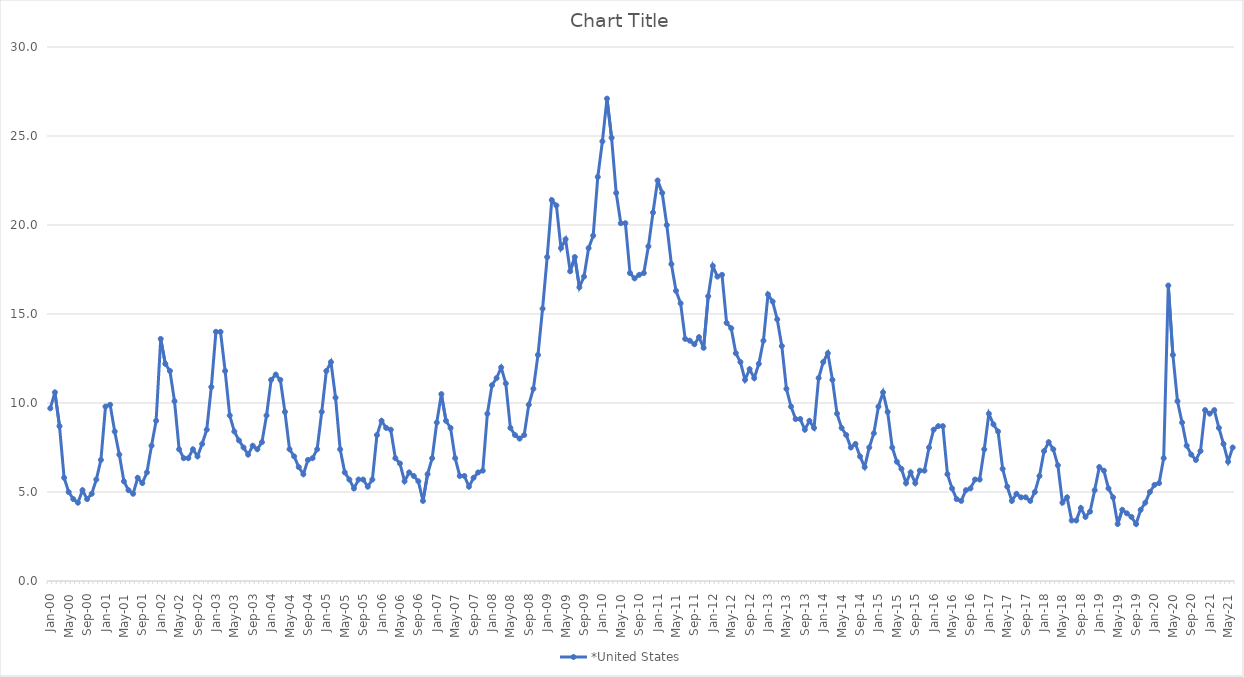
| Category | *United States | Alaska | Alabama | Arkansas | Arizona | California | Colorado | Connecticut | Delaware | Florida | Georgia | Hawaii | Iowa | Idaho | Illinois | Indiana | Kansas | Kentucky | Louisiana | Massachusetts | Maryland | Maine | Michigan | Minnesota | Missouri | Mississippi | Montana | North Carolina | North Dakota | Nebraska | New Hampshire | New Jersey | New Mexico | Nevada | New York | Ohio | Oklahoma | Oregon | Pennsylvania | Rhode Island | South Carolina | South Dakota | Tennessee | Texas | Utah | Virginia | Vermont | Washington | Wisconsin | West Virginia | Wyoming |
|---|---|---|---|---|---|---|---|---|---|---|---|---|---|---|---|---|---|---|---|---|---|---|---|---|---|---|---|---|---|---|---|---|---|---|---|---|---|---|---|---|---|---|---|---|---|---|---|---|---|---|---|
| Jan-00 | 9.7 |  |  |  |  |  |  |  |  |  |  |  |  |  |  |  |  |  |  |  |  |  |  |  |  |  |  |  |  |  |  |  |  |  |  |  |  |  |  |  |  |  |  |  |  |  |  |  |  |  |  |
| Feb-00 | 10.6 |  |  |  |  |  |  |  |  |  |  |  |  |  |  |  |  |  |  |  |  |  |  |  |  |  |  |  |  |  |  |  |  |  |  |  |  |  |  |  |  |  |  |  |  |  |  |  |  |  |  |
| Mar-00 | 8.7 |  |  |  |  |  |  |  |  |  |  |  |  |  |  |  |  |  |  |  |  |  |  |  |  |  |  |  |  |  |  |  |  |  |  |  |  |  |  |  |  |  |  |  |  |  |  |  |  |  |  |
| Apr-00 | 5.8 |  |  |  |  |  |  |  |  |  |  |  |  |  |  |  |  |  |  |  |  |  |  |  |  |  |  |  |  |  |  |  |  |  |  |  |  |  |  |  |  |  |  |  |  |  |  |  |  |  |  |
| May-00 | 5 |  |  |  |  |  |  |  |  |  |  |  |  |  |  |  |  |  |  |  |  |  |  |  |  |  |  |  |  |  |  |  |  |  |  |  |  |  |  |  |  |  |  |  |  |  |  |  |  |  |  |
| Jun-00 | 4.6 |  |  |  |  |  |  |  |  |  |  |  |  |  |  |  |  |  |  |  |  |  |  |  |  |  |  |  |  |  |  |  |  |  |  |  |  |  |  |  |  |  |  |  |  |  |  |  |  |  |  |
| Jul-00 | 4.4 |  |  |  |  |  |  |  |  |  |  |  |  |  |  |  |  |  |  |  |  |  |  |  |  |  |  |  |  |  |  |  |  |  |  |  |  |  |  |  |  |  |  |  |  |  |  |  |  |  |  |
| Aug-00 | 5.1 |  |  |  |  |  |  |  |  |  |  |  |  |  |  |  |  |  |  |  |  |  |  |  |  |  |  |  |  |  |  |  |  |  |  |  |  |  |  |  |  |  |  |  |  |  |  |  |  |  |  |
| Sep-00 | 4.6 |  |  |  |  |  |  |  |  |  |  |  |  |  |  |  |  |  |  |  |  |  |  |  |  |  |  |  |  |  |  |  |  |  |  |  |  |  |  |  |  |  |  |  |  |  |  |  |  |  |  |
| Oct-00 | 4.9 |  |  |  |  |  |  |  |  |  |  |  |  |  |  |  |  |  |  |  |  |  |  |  |  |  |  |  |  |  |  |  |  |  |  |  |  |  |  |  |  |  |  |  |  |  |  |  |  |  |  |
| Nov-00 | 5.7 |  |  |  |  |  |  |  |  |  |  |  |  |  |  |  |  |  |  |  |  |  |  |  |  |  |  |  |  |  |  |  |  |  |  |  |  |  |  |  |  |  |  |  |  |  |  |  |  |  |  |
| Dec-00 | 6.8 |  |  |  |  |  |  |  |  |  |  |  |  |  |  |  |  |  |  |  |  |  |  |  |  |  |  |  |  |  |  |  |  |  |  |  |  |  |  |  |  |  |  |  |  |  |  |  |  |  |  |
| Jan-01 | 9.8 |  |  |  |  |  |  |  |  |  |  |  |  |  |  |  |  |  |  |  |  |  |  |  |  |  |  |  |  |  |  |  |  |  |  |  |  |  |  |  |  |  |  |  |  |  |  |  |  |  |  |
| Feb-01 | 9.9 |  |  |  |  |  |  |  |  |  |  |  |  |  |  |  |  |  |  |  |  |  |  |  |  |  |  |  |  |  |  |  |  |  |  |  |  |  |  |  |  |  |  |  |  |  |  |  |  |  |  |
| Mar-01 | 8.4 |  |  |  |  |  |  |  |  |  |  |  |  |  |  |  |  |  |  |  |  |  |  |  |  |  |  |  |  |  |  |  |  |  |  |  |  |  |  |  |  |  |  |  |  |  |  |  |  |  |  |
| Apr-01 | 7.1 |  |  |  |  |  |  |  |  |  |  |  |  |  |  |  |  |  |  |  |  |  |  |  |  |  |  |  |  |  |  |  |  |  |  |  |  |  |  |  |  |  |  |  |  |  |  |  |  |  |  |
| May-01 | 5.6 |  |  |  |  |  |  |  |  |  |  |  |  |  |  |  |  |  |  |  |  |  |  |  |  |  |  |  |  |  |  |  |  |  |  |  |  |  |  |  |  |  |  |  |  |  |  |  |  |  |  |
| Jun-01 | 5.1 |  |  |  |  |  |  |  |  |  |  |  |  |  |  |  |  |  |  |  |  |  |  |  |  |  |  |  |  |  |  |  |  |  |  |  |  |  |  |  |  |  |  |  |  |  |  |  |  |  |  |
| Jul-01 | 4.9 |  |  |  |  |  |  |  |  |  |  |  |  |  |  |  |  |  |  |  |  |  |  |  |  |  |  |  |  |  |  |  |  |  |  |  |  |  |  |  |  |  |  |  |  |  |  |  |  |  |  |
| Aug-01 | 5.8 |  |  |  |  |  |  |  |  |  |  |  |  |  |  |  |  |  |  |  |  |  |  |  |  |  |  |  |  |  |  |  |  |  |  |  |  |  |  |  |  |  |  |  |  |  |  |  |  |  |  |
| Sep-01 | 5.5 |  |  |  |  |  |  |  |  |  |  |  |  |  |  |  |  |  |  |  |  |  |  |  |  |  |  |  |  |  |  |  |  |  |  |  |  |  |  |  |  |  |  |  |  |  |  |  |  |  |  |
| Oct-01 | 6.1 |  |  |  |  |  |  |  |  |  |  |  |  |  |  |  |  |  |  |  |  |  |  |  |  |  |  |  |  |  |  |  |  |  |  |  |  |  |  |  |  |  |  |  |  |  |  |  |  |  |  |
| Nov-01 | 7.6 |  |  |  |  |  |  |  |  |  |  |  |  |  |  |  |  |  |  |  |  |  |  |  |  |  |  |  |  |  |  |  |  |  |  |  |  |  |  |  |  |  |  |  |  |  |  |  |  |  |  |
| Dec-01 | 9 |  |  |  |  |  |  |  |  |  |  |  |  |  |  |  |  |  |  |  |  |  |  |  |  |  |  |  |  |  |  |  |  |  |  |  |  |  |  |  |  |  |  |  |  |  |  |  |  |  |  |
| Jan-02 | 13.6 |  |  |  |  |  |  |  |  |  |  |  |  |  |  |  |  |  |  |  |  |  |  |  |  |  |  |  |  |  |  |  |  |  |  |  |  |  |  |  |  |  |  |  |  |  |  |  |  |  |  |
| Feb-02 | 12.2 |  |  |  |  |  |  |  |  |  |  |  |  |  |  |  |  |  |  |  |  |  |  |  |  |  |  |  |  |  |  |  |  |  |  |  |  |  |  |  |  |  |  |  |  |  |  |  |  |  |  |
| Mar-02 | 11.8 |  |  |  |  |  |  |  |  |  |  |  |  |  |  |  |  |  |  |  |  |  |  |  |  |  |  |  |  |  |  |  |  |  |  |  |  |  |  |  |  |  |  |  |  |  |  |  |  |  |  |
| Apr-02 | 10.1 |  |  |  |  |  |  |  |  |  |  |  |  |  |  |  |  |  |  |  |  |  |  |  |  |  |  |  |  |  |  |  |  |  |  |  |  |  |  |  |  |  |  |  |  |  |  |  |  |  |  |
| May-02 | 7.4 |  |  |  |  |  |  |  |  |  |  |  |  |  |  |  |  |  |  |  |  |  |  |  |  |  |  |  |  |  |  |  |  |  |  |  |  |  |  |  |  |  |  |  |  |  |  |  |  |  |  |
| Jun-02 | 6.9 |  |  |  |  |  |  |  |  |  |  |  |  |  |  |  |  |  |  |  |  |  |  |  |  |  |  |  |  |  |  |  |  |  |  |  |  |  |  |  |  |  |  |  |  |  |  |  |  |  |  |
| Jul-02 | 6.9 |  |  |  |  |  |  |  |  |  |  |  |  |  |  |  |  |  |  |  |  |  |  |  |  |  |  |  |  |  |  |  |  |  |  |  |  |  |  |  |  |  |  |  |  |  |  |  |  |  |  |
| Aug-02 | 7.4 |  |  |  |  |  |  |  |  |  |  |  |  |  |  |  |  |  |  |  |  |  |  |  |  |  |  |  |  |  |  |  |  |  |  |  |  |  |  |  |  |  |  |  |  |  |  |  |  |  |  |
| Sep-02 | 7 |  |  |  |  |  |  |  |  |  |  |  |  |  |  |  |  |  |  |  |  |  |  |  |  |  |  |  |  |  |  |  |  |  |  |  |  |  |  |  |  |  |  |  |  |  |  |  |  |  |  |
| Oct-02 | 7.7 |  |  |  |  |  |  |  |  |  |  |  |  |  |  |  |  |  |  |  |  |  |  |  |  |  |  |  |  |  |  |  |  |  |  |  |  |  |  |  |  |  |  |  |  |  |  |  |  |  |  |
| Nov-02 | 8.5 |  |  |  |  |  |  |  |  |  |  |  |  |  |  |  |  |  |  |  |  |  |  |  |  |  |  |  |  |  |  |  |  |  |  |  |  |  |  |  |  |  |  |  |  |  |  |  |  |  |  |
| Dec-02 | 10.9 |  |  |  |  |  |  |  |  |  |  |  |  |  |  |  |  |  |  |  |  |  |  |  |  |  |  |  |  |  |  |  |  |  |  |  |  |  |  |  |  |  |  |  |  |  |  |  |  |  |  |
| Jan-03 | 14 |  |  |  |  |  |  |  |  |  |  |  |  |  |  |  |  |  |  |  |  |  |  |  |  |  |  |  |  |  |  |  |  |  |  |  |  |  |  |  |  |  |  |  |  |  |  |  |  |  |  |
| Feb-03 | 14 |  |  |  |  |  |  |  |  |  |  |  |  |  |  |  |  |  |  |  |  |  |  |  |  |  |  |  |  |  |  |  |  |  |  |  |  |  |  |  |  |  |  |  |  |  |  |  |  |  |  |
| Mar-03 | 11.8 |  |  |  |  |  |  |  |  |  |  |  |  |  |  |  |  |  |  |  |  |  |  |  |  |  |  |  |  |  |  |  |  |  |  |  |  |  |  |  |  |  |  |  |  |  |  |  |  |  |  |
| Apr-03 | 9.3 |  |  |  |  |  |  |  |  |  |  |  |  |  |  |  |  |  |  |  |  |  |  |  |  |  |  |  |  |  |  |  |  |  |  |  |  |  |  |  |  |  |  |  |  |  |  |  |  |  |  |
| May-03 | 8.4 |  |  |  |  |  |  |  |  |  |  |  |  |  |  |  |  |  |  |  |  |  |  |  |  |  |  |  |  |  |  |  |  |  |  |  |  |  |  |  |  |  |  |  |  |  |  |  |  |  |  |
| Jun-03 | 7.9 |  |  |  |  |  |  |  |  |  |  |  |  |  |  |  |  |  |  |  |  |  |  |  |  |  |  |  |  |  |  |  |  |  |  |  |  |  |  |  |  |  |  |  |  |  |  |  |  |  |  |
| Jul-03 | 7.5 |  |  |  |  |  |  |  |  |  |  |  |  |  |  |  |  |  |  |  |  |  |  |  |  |  |  |  |  |  |  |  |  |  |  |  |  |  |  |  |  |  |  |  |  |  |  |  |  |  |  |
| Aug-03 | 7.1 |  |  |  |  |  |  |  |  |  |  |  |  |  |  |  |  |  |  |  |  |  |  |  |  |  |  |  |  |  |  |  |  |  |  |  |  |  |  |  |  |  |  |  |  |  |  |  |  |  |  |
| Sep-03 | 7.6 |  |  |  |  |  |  |  |  |  |  |  |  |  |  |  |  |  |  |  |  |  |  |  |  |  |  |  |  |  |  |  |  |  |  |  |  |  |  |  |  |  |  |  |  |  |  |  |  |  |  |
| Oct-03 | 7.4 |  |  |  |  |  |  |  |  |  |  |  |  |  |  |  |  |  |  |  |  |  |  |  |  |  |  |  |  |  |  |  |  |  |  |  |  |  |  |  |  |  |  |  |  |  |  |  |  |  |  |
| Nov-03 | 7.8 |  |  |  |  |  |  |  |  |  |  |  |  |  |  |  |  |  |  |  |  |  |  |  |  |  |  |  |  |  |  |  |  |  |  |  |  |  |  |  |  |  |  |  |  |  |  |  |  |  |  |
| Dec-03 | 9.3 |  |  |  |  |  |  |  |  |  |  |  |  |  |  |  |  |  |  |  |  |  |  |  |  |  |  |  |  |  |  |  |  |  |  |  |  |  |  |  |  |  |  |  |  |  |  |  |  |  |  |
| Jan-04 | 11.3 |  |  |  |  |  |  |  |  |  |  |  |  |  |  |  |  |  |  |  |  |  |  |  |  |  |  |  |  |  |  |  |  |  |  |  |  |  |  |  |  |  |  |  |  |  |  |  |  |  |  |
| Feb-04 | 11.6 |  |  |  |  |  |  |  |  |  |  |  |  |  |  |  |  |  |  |  |  |  |  |  |  |  |  |  |  |  |  |  |  |  |  |  |  |  |  |  |  |  |  |  |  |  |  |  |  |  |  |
| Mar-04 | 11.3 |  |  |  |  |  |  |  |  |  |  |  |  |  |  |  |  |  |  |  |  |  |  |  |  |  |  |  |  |  |  |  |  |  |  |  |  |  |  |  |  |  |  |  |  |  |  |  |  |  |  |
| Apr-04 | 9.5 |  |  |  |  |  |  |  |  |  |  |  |  |  |  |  |  |  |  |  |  |  |  |  |  |  |  |  |  |  |  |  |  |  |  |  |  |  |  |  |  |  |  |  |  |  |  |  |  |  |  |
| May-04 | 7.4 |  |  |  |  |  |  |  |  |  |  |  |  |  |  |  |  |  |  |  |  |  |  |  |  |  |  |  |  |  |  |  |  |  |  |  |  |  |  |  |  |  |  |  |  |  |  |  |  |  |  |
| Jun-04 | 7 |  |  |  |  |  |  |  |  |  |  |  |  |  |  |  |  |  |  |  |  |  |  |  |  |  |  |  |  |  |  |  |  |  |  |  |  |  |  |  |  |  |  |  |  |  |  |  |  |  |  |
| Jul-04 | 6.4 |  |  |  |  |  |  |  |  |  |  |  |  |  |  |  |  |  |  |  |  |  |  |  |  |  |  |  |  |  |  |  |  |  |  |  |  |  |  |  |  |  |  |  |  |  |  |  |  |  |  |
| Aug-04 | 6 |  |  |  |  |  |  |  |  |  |  |  |  |  |  |  |  |  |  |  |  |  |  |  |  |  |  |  |  |  |  |  |  |  |  |  |  |  |  |  |  |  |  |  |  |  |  |  |  |  |  |
| Sep-04 | 6.8 |  |  |  |  |  |  |  |  |  |  |  |  |  |  |  |  |  |  |  |  |  |  |  |  |  |  |  |  |  |  |  |  |  |  |  |  |  |  |  |  |  |  |  |  |  |  |  |  |  |  |
| Oct-04 | 6.9 |  |  |  |  |  |  |  |  |  |  |  |  |  |  |  |  |  |  |  |  |  |  |  |  |  |  |  |  |  |  |  |  |  |  |  |  |  |  |  |  |  |  |  |  |  |  |  |  |  |  |
| Nov-04 | 7.4 |  |  |  |  |  |  |  |  |  |  |  |  |  |  |  |  |  |  |  |  |  |  |  |  |  |  |  |  |  |  |  |  |  |  |  |  |  |  |  |  |  |  |  |  |  |  |  |  |  |  |
| Dec-04 | 9.5 |  |  |  |  |  |  |  |  |  |  |  |  |  |  |  |  |  |  |  |  |  |  |  |  |  |  |  |  |  |  |  |  |  |  |  |  |  |  |  |  |  |  |  |  |  |  |  |  |  |  |
| Jan-05 | 11.8 |  |  |  |  |  |  |  |  |  |  |  |  |  |  |  |  |  |  |  |  |  |  |  |  |  |  |  |  |  |  |  |  |  |  |  |  |  |  |  |  |  |  |  |  |  |  |  |  |  |  |
| Feb-05 | 12.3 |  |  |  |  |  |  |  |  |  |  |  |  |  |  |  |  |  |  |  |  |  |  |  |  |  |  |  |  |  |  |  |  |  |  |  |  |  |  |  |  |  |  |  |  |  |  |  |  |  |  |
| Mar-05 | 10.3 |  |  |  |  |  |  |  |  |  |  |  |  |  |  |  |  |  |  |  |  |  |  |  |  |  |  |  |  |  |  |  |  |  |  |  |  |  |  |  |  |  |  |  |  |  |  |  |  |  |  |
| Apr-05 | 7.4 |  |  |  |  |  |  |  |  |  |  |  |  |  |  |  |  |  |  |  |  |  |  |  |  |  |  |  |  |  |  |  |  |  |  |  |  |  |  |  |  |  |  |  |  |  |  |  |  |  |  |
| May-05 | 6.1 |  |  |  |  |  |  |  |  |  |  |  |  |  |  |  |  |  |  |  |  |  |  |  |  |  |  |  |  |  |  |  |  |  |  |  |  |  |  |  |  |  |  |  |  |  |  |  |  |  |  |
| Jun-05 | 5.7 |  |  |  |  |  |  |  |  |  |  |  |  |  |  |  |  |  |  |  |  |  |  |  |  |  |  |  |  |  |  |  |  |  |  |  |  |  |  |  |  |  |  |  |  |  |  |  |  |  |  |
| Jul-05 | 5.2 |  |  |  |  |  |  |  |  |  |  |  |  |  |  |  |  |  |  |  |  |  |  |  |  |  |  |  |  |  |  |  |  |  |  |  |  |  |  |  |  |  |  |  |  |  |  |  |  |  |  |
| Aug-05 | 5.7 |  |  |  |  |  |  |  |  |  |  |  |  |  |  |  |  |  |  |  |  |  |  |  |  |  |  |  |  |  |  |  |  |  |  |  |  |  |  |  |  |  |  |  |  |  |  |  |  |  |  |
| Sep-05 | 5.7 |  |  |  |  |  |  |  |  |  |  |  |  |  |  |  |  |  |  |  |  |  |  |  |  |  |  |  |  |  |  |  |  |  |  |  |  |  |  |  |  |  |  |  |  |  |  |  |  |  |  |
| Oct-05 | 5.3 |  |  |  |  |  |  |  |  |  |  |  |  |  |  |  |  |  |  |  |  |  |  |  |  |  |  |  |  |  |  |  |  |  |  |  |  |  |  |  |  |  |  |  |  |  |  |  |  |  |  |
| Nov-05 | 5.7 |  |  |  |  |  |  |  |  |  |  |  |  |  |  |  |  |  |  |  |  |  |  |  |  |  |  |  |  |  |  |  |  |  |  |  |  |  |  |  |  |  |  |  |  |  |  |  |  |  |  |
| Dec-05 | 8.2 |  |  |  |  |  |  |  |  |  |  |  |  |  |  |  |  |  |  |  |  |  |  |  |  |  |  |  |  |  |  |  |  |  |  |  |  |  |  |  |  |  |  |  |  |  |  |  |  |  |  |
| Jan-06 | 9 |  |  |  |  |  |  |  |  |  |  |  |  |  |  |  |  |  |  |  |  |  |  |  |  |  |  |  |  |  |  |  |  |  |  |  |  |  |  |  |  |  |  |  |  |  |  |  |  |  |  |
| Feb-06 | 8.6 |  |  |  |  |  |  |  |  |  |  |  |  |  |  |  |  |  |  |  |  |  |  |  |  |  |  |  |  |  |  |  |  |  |  |  |  |  |  |  |  |  |  |  |  |  |  |  |  |  |  |
| Mar-06 | 8.5 |  |  |  |  |  |  |  |  |  |  |  |  |  |  |  |  |  |  |  |  |  |  |  |  |  |  |  |  |  |  |  |  |  |  |  |  |  |  |  |  |  |  |  |  |  |  |  |  |  |  |
| Apr-06 | 6.9 |  |  |  |  |  |  |  |  |  |  |  |  |  |  |  |  |  |  |  |  |  |  |  |  |  |  |  |  |  |  |  |  |  |  |  |  |  |  |  |  |  |  |  |  |  |  |  |  |  |  |
| May-06 | 6.6 |  |  |  |  |  |  |  |  |  |  |  |  |  |  |  |  |  |  |  |  |  |  |  |  |  |  |  |  |  |  |  |  |  |  |  |  |  |  |  |  |  |  |  |  |  |  |  |  |  |  |
| Jun-06 | 5.6 |  |  |  |  |  |  |  |  |  |  |  |  |  |  |  |  |  |  |  |  |  |  |  |  |  |  |  |  |  |  |  |  |  |  |  |  |  |  |  |  |  |  |  |  |  |  |  |  |  |  |
| Jul-06 | 6.1 |  |  |  |  |  |  |  |  |  |  |  |  |  |  |  |  |  |  |  |  |  |  |  |  |  |  |  |  |  |  |  |  |  |  |  |  |  |  |  |  |  |  |  |  |  |  |  |  |  |  |
| Aug-06 | 5.9 |  |  |  |  |  |  |  |  |  |  |  |  |  |  |  |  |  |  |  |  |  |  |  |  |  |  |  |  |  |  |  |  |  |  |  |  |  |  |  |  |  |  |  |  |  |  |  |  |  |  |
| Sep-06 | 5.6 |  |  |  |  |  |  |  |  |  |  |  |  |  |  |  |  |  |  |  |  |  |  |  |  |  |  |  |  |  |  |  |  |  |  |  |  |  |  |  |  |  |  |  |  |  |  |  |  |  |  |
| Oct-06 | 4.5 |  |  |  |  |  |  |  |  |  |  |  |  |  |  |  |  |  |  |  |  |  |  |  |  |  |  |  |  |  |  |  |  |  |  |  |  |  |  |  |  |  |  |  |  |  |  |  |  |  |  |
| Nov-06 | 6 |  |  |  |  |  |  |  |  |  |  |  |  |  |  |  |  |  |  |  |  |  |  |  |  |  |  |  |  |  |  |  |  |  |  |  |  |  |  |  |  |  |  |  |  |  |  |  |  |  |  |
| Dec-06 | 6.9 |  |  |  |  |  |  |  |  |  |  |  |  |  |  |  |  |  |  |  |  |  |  |  |  |  |  |  |  |  |  |  |  |  |  |  |  |  |  |  |  |  |  |  |  |  |  |  |  |  |  |
| Jan-07 | 8.9 |  |  |  |  |  |  |  |  |  |  |  |  |  |  |  |  |  |  |  |  |  |  |  |  |  |  |  |  |  |  |  |  |  |  |  |  |  |  |  |  |  |  |  |  |  |  |  |  |  |  |
| Feb-07 | 10.5 |  |  |  |  |  |  |  |  |  |  |  |  |  |  |  |  |  |  |  |  |  |  |  |  |  |  |  |  |  |  |  |  |  |  |  |  |  |  |  |  |  |  |  |  |  |  |  |  |  |  |
| Mar-07 | 9 |  |  |  |  |  |  |  |  |  |  |  |  |  |  |  |  |  |  |  |  |  |  |  |  |  |  |  |  |  |  |  |  |  |  |  |  |  |  |  |  |  |  |  |  |  |  |  |  |  |  |
| Apr-07 | 8.6 |  |  |  |  |  |  |  |  |  |  |  |  |  |  |  |  |  |  |  |  |  |  |  |  |  |  |  |  |  |  |  |  |  |  |  |  |  |  |  |  |  |  |  |  |  |  |  |  |  |  |
| May-07 | 6.9 |  |  |  |  |  |  |  |  |  |  |  |  |  |  |  |  |  |  |  |  |  |  |  |  |  |  |  |  |  |  |  |  |  |  |  |  |  |  |  |  |  |  |  |  |  |  |  |  |  |  |
| Jun-07 | 5.9 |  |  |  |  |  |  |  |  |  |  |  |  |  |  |  |  |  |  |  |  |  |  |  |  |  |  |  |  |  |  |  |  |  |  |  |  |  |  |  |  |  |  |  |  |  |  |  |  |  |  |
| Jul-07 | 5.9 |  |  |  |  |  |  |  |  |  |  |  |  |  |  |  |  |  |  |  |  |  |  |  |  |  |  |  |  |  |  |  |  |  |  |  |  |  |  |  |  |  |  |  |  |  |  |  |  |  |  |
| Aug-07 | 5.3 |  |  |  |  |  |  |  |  |  |  |  |  |  |  |  |  |  |  |  |  |  |  |  |  |  |  |  |  |  |  |  |  |  |  |  |  |  |  |  |  |  |  |  |  |  |  |  |  |  |  |
| Sep-07 | 5.8 |  |  |  |  |  |  |  |  |  |  |  |  |  |  |  |  |  |  |  |  |  |  |  |  |  |  |  |  |  |  |  |  |  |  |  |  |  |  |  |  |  |  |  |  |  |  |  |  |  |  |
| Oct-07 | 6.1 |  |  |  |  |  |  |  |  |  |  |  |  |  |  |  |  |  |  |  |  |  |  |  |  |  |  |  |  |  |  |  |  |  |  |  |  |  |  |  |  |  |  |  |  |  |  |  |  |  |  |
| Nov-07 | 6.2 |  |  |  |  |  |  |  |  |  |  |  |  |  |  |  |  |  |  |  |  |  |  |  |  |  |  |  |  |  |  |  |  |  |  |  |  |  |  |  |  |  |  |  |  |  |  |  |  |  |  |
| Dec-07 | 9.4 |  |  |  |  |  |  |  |  |  |  |  |  |  |  |  |  |  |  |  |  |  |  |  |  |  |  |  |  |  |  |  |  |  |  |  |  |  |  |  |  |  |  |  |  |  |  |  |  |  |  |
| Jan-08 | 11 |  |  |  |  |  |  |  |  |  |  |  |  |  |  |  |  |  |  |  |  |  |  |  |  |  |  |  |  |  |  |  |  |  |  |  |  |  |  |  |  |  |  |  |  |  |  |  |  |  |  |
| Feb-08 | 11.4 |  |  |  |  |  |  |  |  |  |  |  |  |  |  |  |  |  |  |  |  |  |  |  |  |  |  |  |  |  |  |  |  |  |  |  |  |  |  |  |  |  |  |  |  |  |  |  |  |  |  |
| Mar-08 | 12 |  |  |  |  |  |  |  |  |  |  |  |  |  |  |  |  |  |  |  |  |  |  |  |  |  |  |  |  |  |  |  |  |  |  |  |  |  |  |  |  |  |  |  |  |  |  |  |  |  |  |
| Apr-08 | 11.1 |  |  |  |  |  |  |  |  |  |  |  |  |  |  |  |  |  |  |  |  |  |  |  |  |  |  |  |  |  |  |  |  |  |  |  |  |  |  |  |  |  |  |  |  |  |  |  |  |  |  |
| May-08 | 8.6 |  |  |  |  |  |  |  |  |  |  |  |  |  |  |  |  |  |  |  |  |  |  |  |  |  |  |  |  |  |  |  |  |  |  |  |  |  |  |  |  |  |  |  |  |  |  |  |  |  |  |
| Jun-08 | 8.2 |  |  |  |  |  |  |  |  |  |  |  |  |  |  |  |  |  |  |  |  |  |  |  |  |  |  |  |  |  |  |  |  |  |  |  |  |  |  |  |  |  |  |  |  |  |  |  |  |  |  |
| Jul-08 | 8 |  |  |  |  |  |  |  |  |  |  |  |  |  |  |  |  |  |  |  |  |  |  |  |  |  |  |  |  |  |  |  |  |  |  |  |  |  |  |  |  |  |  |  |  |  |  |  |  |  |  |
| Aug-08 | 8.2 |  |  |  |  |  |  |  |  |  |  |  |  |  |  |  |  |  |  |  |  |  |  |  |  |  |  |  |  |  |  |  |  |  |  |  |  |  |  |  |  |  |  |  |  |  |  |  |  |  |  |
| Sep-08 | 9.9 |  |  |  |  |  |  |  |  |  |  |  |  |  |  |  |  |  |  |  |  |  |  |  |  |  |  |  |  |  |  |  |  |  |  |  |  |  |  |  |  |  |  |  |  |  |  |  |  |  |  |
| Oct-08 | 10.8 |  |  |  |  |  |  |  |  |  |  |  |  |  |  |  |  |  |  |  |  |  |  |  |  |  |  |  |  |  |  |  |  |  |  |  |  |  |  |  |  |  |  |  |  |  |  |  |  |  |  |
| Nov-08 | 12.7 |  |  |  |  |  |  |  |  |  |  |  |  |  |  |  |  |  |  |  |  |  |  |  |  |  |  |  |  |  |  |  |  |  |  |  |  |  |  |  |  |  |  |  |  |  |  |  |  |  |  |
| Dec-08 | 15.3 |  |  |  |  |  |  |  |  |  |  |  |  |  |  |  |  |  |  |  |  |  |  |  |  |  |  |  |  |  |  |  |  |  |  |  |  |  |  |  |  |  |  |  |  |  |  |  |  |  |  |
| Jan-09 | 18.2 |  |  |  |  |  |  |  |  |  |  |  |  |  |  |  |  |  |  |  |  |  |  |  |  |  |  |  |  |  |  |  |  |  |  |  |  |  |  |  |  |  |  |  |  |  |  |  |  |  |  |
| Feb-09 | 21.4 |  |  |  |  |  |  |  |  |  |  |  |  |  |  |  |  |  |  |  |  |  |  |  |  |  |  |  |  |  |  |  |  |  |  |  |  |  |  |  |  |  |  |  |  |  |  |  |  |  |  |
| Mar-09 | 21.1 |  |  |  |  |  |  |  |  |  |  |  |  |  |  |  |  |  |  |  |  |  |  |  |  |  |  |  |  |  |  |  |  |  |  |  |  |  |  |  |  |  |  |  |  |  |  |  |  |  |  |
| Apr-09 | 18.7 |  |  |  |  |  |  |  |  |  |  |  |  |  |  |  |  |  |  |  |  |  |  |  |  |  |  |  |  |  |  |  |  |  |  |  |  |  |  |  |  |  |  |  |  |  |  |  |  |  |  |
| May-09 | 19.2 |  |  |  |  |  |  |  |  |  |  |  |  |  |  |  |  |  |  |  |  |  |  |  |  |  |  |  |  |  |  |  |  |  |  |  |  |  |  |  |  |  |  |  |  |  |  |  |  |  |  |
| Jun-09 | 17.4 |  |  |  |  |  |  |  |  |  |  |  |  |  |  |  |  |  |  |  |  |  |  |  |  |  |  |  |  |  |  |  |  |  |  |  |  |  |  |  |  |  |  |  |  |  |  |  |  |  |  |
| Jul-09 | 18.2 |  |  |  |  |  |  |  |  |  |  |  |  |  |  |  |  |  |  |  |  |  |  |  |  |  |  |  |  |  |  |  |  |  |  |  |  |  |  |  |  |  |  |  |  |  |  |  |  |  |  |
| Aug-09 | 16.5 |  |  |  |  |  |  |  |  |  |  |  |  |  |  |  |  |  |  |  |  |  |  |  |  |  |  |  |  |  |  |  |  |  |  |  |  |  |  |  |  |  |  |  |  |  |  |  |  |  |  |
| Sep-09 | 17.1 |  |  |  |  |  |  |  |  |  |  |  |  |  |  |  |  |  |  |  |  |  |  |  |  |  |  |  |  |  |  |  |  |  |  |  |  |  |  |  |  |  |  |  |  |  |  |  |  |  |  |
| Oct-09 | 18.7 |  |  |  |  |  |  |  |  |  |  |  |  |  |  |  |  |  |  |  |  |  |  |  |  |  |  |  |  |  |  |  |  |  |  |  |  |  |  |  |  |  |  |  |  |  |  |  |  |  |  |
| Nov-09 | 19.4 |  |  |  |  |  |  |  |  |  |  |  |  |  |  |  |  |  |  |  |  |  |  |  |  |  |  |  |  |  |  |  |  |  |  |  |  |  |  |  |  |  |  |  |  |  |  |  |  |  |  |
| Dec-09 | 22.7 |  |  |  |  |  |  |  |  |  |  |  |  |  |  |  |  |  |  |  |  |  |  |  |  |  |  |  |  |  |  |  |  |  |  |  |  |  |  |  |  |  |  |  |  |  |  |  |  |  |  |
| Jan-10 | 24.7 |  |  |  |  |  |  |  |  |  |  |  |  |  |  |  |  |  |  |  |  |  |  |  |  |  |  |  |  |  |  |  |  |  |  |  |  |  |  |  |  |  |  |  |  |  |  |  |  |  |  |
| Feb-10 | 27.1 |  |  |  |  |  |  |  |  |  |  |  |  |  |  |  |  |  |  |  |  |  |  |  |  |  |  |  |  |  |  |  |  |  |  |  |  |  |  |  |  |  |  |  |  |  |  |  |  |  |  |
| Mar-10 | 24.9 |  |  |  |  |  |  |  |  |  |  |  |  |  |  |  |  |  |  |  |  |  |  |  |  |  |  |  |  |  |  |  |  |  |  |  |  |  |  |  |  |  |  |  |  |  |  |  |  |  |  |
| Apr-10 | 21.8 |  |  |  |  |  |  |  |  |  |  |  |  |  |  |  |  |  |  |  |  |  |  |  |  |  |  |  |  |  |  |  |  |  |  |  |  |  |  |  |  |  |  |  |  |  |  |  |  |  |  |
| May-10 | 20.1 |  |  |  |  |  |  |  |  |  |  |  |  |  |  |  |  |  |  |  |  |  |  |  |  |  |  |  |  |  |  |  |  |  |  |  |  |  |  |  |  |  |  |  |  |  |  |  |  |  |  |
| Jun-10 | 20.1 |  |  |  |  |  |  |  |  |  |  |  |  |  |  |  |  |  |  |  |  |  |  |  |  |  |  |  |  |  |  |  |  |  |  |  |  |  |  |  |  |  |  |  |  |  |  |  |  |  |  |
| Jul-10 | 17.3 |  |  |  |  |  |  |  |  |  |  |  |  |  |  |  |  |  |  |  |  |  |  |  |  |  |  |  |  |  |  |  |  |  |  |  |  |  |  |  |  |  |  |  |  |  |  |  |  |  |  |
| Aug-10 | 17 |  |  |  |  |  |  |  |  |  |  |  |  |  |  |  |  |  |  |  |  |  |  |  |  |  |  |  |  |  |  |  |  |  |  |  |  |  |  |  |  |  |  |  |  |  |  |  |  |  |  |
| Sep-10 | 17.2 |  |  |  |  |  |  |  |  |  |  |  |  |  |  |  |  |  |  |  |  |  |  |  |  |  |  |  |  |  |  |  |  |  |  |  |  |  |  |  |  |  |  |  |  |  |  |  |  |  |  |
| Oct-10 | 17.3 |  |  |  |  |  |  |  |  |  |  |  |  |  |  |  |  |  |  |  |  |  |  |  |  |  |  |  |  |  |  |  |  |  |  |  |  |  |  |  |  |  |  |  |  |  |  |  |  |  |  |
| Nov-10 | 18.8 |  |  |  |  |  |  |  |  |  |  |  |  |  |  |  |  |  |  |  |  |  |  |  |  |  |  |  |  |  |  |  |  |  |  |  |  |  |  |  |  |  |  |  |  |  |  |  |  |  |  |
| Dec-10 | 20.7 |  |  |  |  |  |  |  |  |  |  |  |  |  |  |  |  |  |  |  |  |  |  |  |  |  |  |  |  |  |  |  |  |  |  |  |  |  |  |  |  |  |  |  |  |  |  |  |  |  |  |
| Jan-11 | 22.5 |  |  |  |  |  |  |  |  |  |  |  |  |  |  |  |  |  |  |  |  |  |  |  |  |  |  |  |  |  |  |  |  |  |  |  |  |  |  |  |  |  |  |  |  |  |  |  |  |  |  |
| Feb-11 | 21.8 |  |  |  |  |  |  |  |  |  |  |  |  |  |  |  |  |  |  |  |  |  |  |  |  |  |  |  |  |  |  |  |  |  |  |  |  |  |  |  |  |  |  |  |  |  |  |  |  |  |  |
| Mar-11 | 20 |  |  |  |  |  |  |  |  |  |  |  |  |  |  |  |  |  |  |  |  |  |  |  |  |  |  |  |  |  |  |  |  |  |  |  |  |  |  |  |  |  |  |  |  |  |  |  |  |  |  |
| Apr-11 | 17.8 |  |  |  |  |  |  |  |  |  |  |  |  |  |  |  |  |  |  |  |  |  |  |  |  |  |  |  |  |  |  |  |  |  |  |  |  |  |  |  |  |  |  |  |  |  |  |  |  |  |  |
| May-11 | 16.3 |  |  |  |  |  |  |  |  |  |  |  |  |  |  |  |  |  |  |  |  |  |  |  |  |  |  |  |  |  |  |  |  |  |  |  |  |  |  |  |  |  |  |  |  |  |  |  |  |  |  |
| Jun-11 | 15.6 |  |  |  |  |  |  |  |  |  |  |  |  |  |  |  |  |  |  |  |  |  |  |  |  |  |  |  |  |  |  |  |  |  |  |  |  |  |  |  |  |  |  |  |  |  |  |  |  |  |  |
| Jul-11 | 13.6 |  |  |  |  |  |  |  |  |  |  |  |  |  |  |  |  |  |  |  |  |  |  |  |  |  |  |  |  |  |  |  |  |  |  |  |  |  |  |  |  |  |  |  |  |  |  |  |  |  |  |
| Aug-11 | 13.5 |  |  |  |  |  |  |  |  |  |  |  |  |  |  |  |  |  |  |  |  |  |  |  |  |  |  |  |  |  |  |  |  |  |  |  |  |  |  |  |  |  |  |  |  |  |  |  |  |  |  |
| Sep-11 | 13.3 |  |  |  |  |  |  |  |  |  |  |  |  |  |  |  |  |  |  |  |  |  |  |  |  |  |  |  |  |  |  |  |  |  |  |  |  |  |  |  |  |  |  |  |  |  |  |  |  |  |  |
| Oct-11 | 13.7 |  |  |  |  |  |  |  |  |  |  |  |  |  |  |  |  |  |  |  |  |  |  |  |  |  |  |  |  |  |  |  |  |  |  |  |  |  |  |  |  |  |  |  |  |  |  |  |  |  |  |
| Nov-11 | 13.1 |  |  |  |  |  |  |  |  |  |  |  |  |  |  |  |  |  |  |  |  |  |  |  |  |  |  |  |  |  |  |  |  |  |  |  |  |  |  |  |  |  |  |  |  |  |  |  |  |  |  |
| Dec-11 | 16 |  |  |  |  |  |  |  |  |  |  |  |  |  |  |  |  |  |  |  |  |  |  |  |  |  |  |  |  |  |  |  |  |  |  |  |  |  |  |  |  |  |  |  |  |  |  |  |  |  |  |
| Jan-12 | 17.7 |  |  |  |  |  |  |  |  |  |  |  |  |  |  |  |  |  |  |  |  |  |  |  |  |  |  |  |  |  |  |  |  |  |  |  |  |  |  |  |  |  |  |  |  |  |  |  |  |  |  |
| Feb-12 | 17.1 |  |  |  |  |  |  |  |  |  |  |  |  |  |  |  |  |  |  |  |  |  |  |  |  |  |  |  |  |  |  |  |  |  |  |  |  |  |  |  |  |  |  |  |  |  |  |  |  |  |  |
| Mar-12 | 17.2 |  |  |  |  |  |  |  |  |  |  |  |  |  |  |  |  |  |  |  |  |  |  |  |  |  |  |  |  |  |  |  |  |  |  |  |  |  |  |  |  |  |  |  |  |  |  |  |  |  |  |
| Apr-12 | 14.5 |  |  |  |  |  |  |  |  |  |  |  |  |  |  |  |  |  |  |  |  |  |  |  |  |  |  |  |  |  |  |  |  |  |  |  |  |  |  |  |  |  |  |  |  |  |  |  |  |  |  |
| May-12 | 14.2 |  |  |  |  |  |  |  |  |  |  |  |  |  |  |  |  |  |  |  |  |  |  |  |  |  |  |  |  |  |  |  |  |  |  |  |  |  |  |  |  |  |  |  |  |  |  |  |  |  |  |
| Jun-12 | 12.8 |  |  |  |  |  |  |  |  |  |  |  |  |  |  |  |  |  |  |  |  |  |  |  |  |  |  |  |  |  |  |  |  |  |  |  |  |  |  |  |  |  |  |  |  |  |  |  |  |  |  |
| Jul-12 | 12.3 |  |  |  |  |  |  |  |  |  |  |  |  |  |  |  |  |  |  |  |  |  |  |  |  |  |  |  |  |  |  |  |  |  |  |  |  |  |  |  |  |  |  |  |  |  |  |  |  |  |  |
| Aug-12 | 11.3 |  |  |  |  |  |  |  |  |  |  |  |  |  |  |  |  |  |  |  |  |  |  |  |  |  |  |  |  |  |  |  |  |  |  |  |  |  |  |  |  |  |  |  |  |  |  |  |  |  |  |
| Sep-12 | 11.9 |  |  |  |  |  |  |  |  |  |  |  |  |  |  |  |  |  |  |  |  |  |  |  |  |  |  |  |  |  |  |  |  |  |  |  |  |  |  |  |  |  |  |  |  |  |  |  |  |  |  |
| Oct-12 | 11.4 |  |  |  |  |  |  |  |  |  |  |  |  |  |  |  |  |  |  |  |  |  |  |  |  |  |  |  |  |  |  |  |  |  |  |  |  |  |  |  |  |  |  |  |  |  |  |  |  |  |  |
| Nov-12 | 12.2 |  |  |  |  |  |  |  |  |  |  |  |  |  |  |  |  |  |  |  |  |  |  |  |  |  |  |  |  |  |  |  |  |  |  |  |  |  |  |  |  |  |  |  |  |  |  |  |  |  |  |
| Dec-12 | 13.5 |  |  |  |  |  |  |  |  |  |  |  |  |  |  |  |  |  |  |  |  |  |  |  |  |  |  |  |  |  |  |  |  |  |  |  |  |  |  |  |  |  |  |  |  |  |  |  |  |  |  |
| Jan-13 | 16.1 |  |  |  |  |  |  |  |  |  |  |  |  |  |  |  |  |  |  |  |  |  |  |  |  |  |  |  |  |  |  |  |  |  |  |  |  |  |  |  |  |  |  |  |  |  |  |  |  |  |  |
| Feb-13 | 15.7 |  |  |  |  |  |  |  |  |  |  |  |  |  |  |  |  |  |  |  |  |  |  |  |  |  |  |  |  |  |  |  |  |  |  |  |  |  |  |  |  |  |  |  |  |  |  |  |  |  |  |
| Mar-13 | 14.7 |  |  |  |  |  |  |  |  |  |  |  |  |  |  |  |  |  |  |  |  |  |  |  |  |  |  |  |  |  |  |  |  |  |  |  |  |  |  |  |  |  |  |  |  |  |  |  |  |  |  |
| Apr-13 | 13.2 |  |  |  |  |  |  |  |  |  |  |  |  |  |  |  |  |  |  |  |  |  |  |  |  |  |  |  |  |  |  |  |  |  |  |  |  |  |  |  |  |  |  |  |  |  |  |  |  |  |  |
| May-13 | 10.8 |  |  |  |  |  |  |  |  |  |  |  |  |  |  |  |  |  |  |  |  |  |  |  |  |  |  |  |  |  |  |  |  |  |  |  |  |  |  |  |  |  |  |  |  |  |  |  |  |  |  |
| Jun-13 | 9.8 |  |  |  |  |  |  |  |  |  |  |  |  |  |  |  |  |  |  |  |  |  |  |  |  |  |  |  |  |  |  |  |  |  |  |  |  |  |  |  |  |  |  |  |  |  |  |  |  |  |  |
| Jul-13 | 9.1 |  |  |  |  |  |  |  |  |  |  |  |  |  |  |  |  |  |  |  |  |  |  |  |  |  |  |  |  |  |  |  |  |  |  |  |  |  |  |  |  |  |  |  |  |  |  |  |  |  |  |
| Aug-13 | 9.1 |  |  |  |  |  |  |  |  |  |  |  |  |  |  |  |  |  |  |  |  |  |  |  |  |  |  |  |  |  |  |  |  |  |  |  |  |  |  |  |  |  |  |  |  |  |  |  |  |  |  |
| Sep-13 | 8.5 |  |  |  |  |  |  |  |  |  |  |  |  |  |  |  |  |  |  |  |  |  |  |  |  |  |  |  |  |  |  |  |  |  |  |  |  |  |  |  |  |  |  |  |  |  |  |  |  |  |  |
| Oct-13 | 9 |  |  |  |  |  |  |  |  |  |  |  |  |  |  |  |  |  |  |  |  |  |  |  |  |  |  |  |  |  |  |  |  |  |  |  |  |  |  |  |  |  |  |  |  |  |  |  |  |  |  |
| Nov-13 | 8.6 |  |  |  |  |  |  |  |  |  |  |  |  |  |  |  |  |  |  |  |  |  |  |  |  |  |  |  |  |  |  |  |  |  |  |  |  |  |  |  |  |  |  |  |  |  |  |  |  |  |  |
| Dec-13 | 11.4 |  |  |  |  |  |  |  |  |  |  |  |  |  |  |  |  |  |  |  |  |  |  |  |  |  |  |  |  |  |  |  |  |  |  |  |  |  |  |  |  |  |  |  |  |  |  |  |  |  |  |
| Jan-14 | 12.3 |  |  |  |  |  |  |  |  |  |  |  |  |  |  |  |  |  |  |  |  |  |  |  |  |  |  |  |  |  |  |  |  |  |  |  |  |  |  |  |  |  |  |  |  |  |  |  |  |  |  |
| Feb-14 | 12.8 |  |  |  |  |  |  |  |  |  |  |  |  |  |  |  |  |  |  |  |  |  |  |  |  |  |  |  |  |  |  |  |  |  |  |  |  |  |  |  |  |  |  |  |  |  |  |  |  |  |  |
| Mar-14 | 11.3 |  |  |  |  |  |  |  |  |  |  |  |  |  |  |  |  |  |  |  |  |  |  |  |  |  |  |  |  |  |  |  |  |  |  |  |  |  |  |  |  |  |  |  |  |  |  |  |  |  |  |
| Apr-14 | 9.4 |  |  |  |  |  |  |  |  |  |  |  |  |  |  |  |  |  |  |  |  |  |  |  |  |  |  |  |  |  |  |  |  |  |  |  |  |  |  |  |  |  |  |  |  |  |  |  |  |  |  |
| May-14 | 8.6 |  |  |  |  |  |  |  |  |  |  |  |  |  |  |  |  |  |  |  |  |  |  |  |  |  |  |  |  |  |  |  |  |  |  |  |  |  |  |  |  |  |  |  |  |  |  |  |  |  |  |
| Jun-14 | 8.2 |  |  |  |  |  |  |  |  |  |  |  |  |  |  |  |  |  |  |  |  |  |  |  |  |  |  |  |  |  |  |  |  |  |  |  |  |  |  |  |  |  |  |  |  |  |  |  |  |  |  |
| Jul-14 | 7.5 |  |  |  |  |  |  |  |  |  |  |  |  |  |  |  |  |  |  |  |  |  |  |  |  |  |  |  |  |  |  |  |  |  |  |  |  |  |  |  |  |  |  |  |  |  |  |  |  |  |  |
| Aug-14 | 7.7 |  |  |  |  |  |  |  |  |  |  |  |  |  |  |  |  |  |  |  |  |  |  |  |  |  |  |  |  |  |  |  |  |  |  |  |  |  |  |  |  |  |  |  |  |  |  |  |  |  |  |
| Sep-14 | 7 |  |  |  |  |  |  |  |  |  |  |  |  |  |  |  |  |  |  |  |  |  |  |  |  |  |  |  |  |  |  |  |  |  |  |  |  |  |  |  |  |  |  |  |  |  |  |  |  |  |  |
| Oct-14 | 6.4 |  |  |  |  |  |  |  |  |  |  |  |  |  |  |  |  |  |  |  |  |  |  |  |  |  |  |  |  |  |  |  |  |  |  |  |  |  |  |  |  |  |  |  |  |  |  |  |  |  |  |
| Nov-14 | 7.5 |  |  |  |  |  |  |  |  |  |  |  |  |  |  |  |  |  |  |  |  |  |  |  |  |  |  |  |  |  |  |  |  |  |  |  |  |  |  |  |  |  |  |  |  |  |  |  |  |  |  |
| Dec-14 | 8.3 |  |  |  |  |  |  |  |  |  |  |  |  |  |  |  |  |  |  |  |  |  |  |  |  |  |  |  |  |  |  |  |  |  |  |  |  |  |  |  |  |  |  |  |  |  |  |  |  |  |  |
| Jan-15 | 9.8 |  |  |  |  |  |  |  |  |  |  |  |  |  |  |  |  |  |  |  |  |  |  |  |  |  |  |  |  |  |  |  |  |  |  |  |  |  |  |  |  |  |  |  |  |  |  |  |  |  |  |
| Feb-15 | 10.6 |  |  |  |  |  |  |  |  |  |  |  |  |  |  |  |  |  |  |  |  |  |  |  |  |  |  |  |  |  |  |  |  |  |  |  |  |  |  |  |  |  |  |  |  |  |  |  |  |  |  |
| Mar-15 | 9.5 |  |  |  |  |  |  |  |  |  |  |  |  |  |  |  |  |  |  |  |  |  |  |  |  |  |  |  |  |  |  |  |  |  |  |  |  |  |  |  |  |  |  |  |  |  |  |  |  |  |  |
| Apr-15 | 7.5 |  |  |  |  |  |  |  |  |  |  |  |  |  |  |  |  |  |  |  |  |  |  |  |  |  |  |  |  |  |  |  |  |  |  |  |  |  |  |  |  |  |  |  |  |  |  |  |  |  |  |
| May-15 | 6.7 |  |  |  |  |  |  |  |  |  |  |  |  |  |  |  |  |  |  |  |  |  |  |  |  |  |  |  |  |  |  |  |  |  |  |  |  |  |  |  |  |  |  |  |  |  |  |  |  |  |  |
| Jun-15 | 6.3 |  |  |  |  |  |  |  |  |  |  |  |  |  |  |  |  |  |  |  |  |  |  |  |  |  |  |  |  |  |  |  |  |  |  |  |  |  |  |  |  |  |  |  |  |  |  |  |  |  |  |
| Jul-15 | 5.5 |  |  |  |  |  |  |  |  |  |  |  |  |  |  |  |  |  |  |  |  |  |  |  |  |  |  |  |  |  |  |  |  |  |  |  |  |  |  |  |  |  |  |  |  |  |  |  |  |  |  |
| Aug-15 | 6.1 |  |  |  |  |  |  |  |  |  |  |  |  |  |  |  |  |  |  |  |  |  |  |  |  |  |  |  |  |  |  |  |  |  |  |  |  |  |  |  |  |  |  |  |  |  |  |  |  |  |  |
| Sep-15 | 5.5 |  |  |  |  |  |  |  |  |  |  |  |  |  |  |  |  |  |  |  |  |  |  |  |  |  |  |  |  |  |  |  |  |  |  |  |  |  |  |  |  |  |  |  |  |  |  |  |  |  |  |
| Oct-15 | 6.2 |  |  |  |  |  |  |  |  |  |  |  |  |  |  |  |  |  |  |  |  |  |  |  |  |  |  |  |  |  |  |  |  |  |  |  |  |  |  |  |  |  |  |  |  |  |  |  |  |  |  |
| Nov-15 | 6.2 |  |  |  |  |  |  |  |  |  |  |  |  |  |  |  |  |  |  |  |  |  |  |  |  |  |  |  |  |  |  |  |  |  |  |  |  |  |  |  |  |  |  |  |  |  |  |  |  |  |  |
| Dec-15 | 7.5 |  |  |  |  |  |  |  |  |  |  |  |  |  |  |  |  |  |  |  |  |  |  |  |  |  |  |  |  |  |  |  |  |  |  |  |  |  |  |  |  |  |  |  |  |  |  |  |  |  |  |
| Jan-16 | 8.5 |  |  |  |  |  |  |  |  |  |  |  |  |  |  |  |  |  |  |  |  |  |  |  |  |  |  |  |  |  |  |  |  |  |  |  |  |  |  |  |  |  |  |  |  |  |  |  |  |  |  |
| Feb-16 | 8.7 |  |  |  |  |  |  |  |  |  |  |  |  |  |  |  |  |  |  |  |  |  |  |  |  |  |  |  |  |  |  |  |  |  |  |  |  |  |  |  |  |  |  |  |  |  |  |  |  |  |  |
| Mar-16 | 8.7 |  |  |  |  |  |  |  |  |  |  |  |  |  |  |  |  |  |  |  |  |  |  |  |  |  |  |  |  |  |  |  |  |  |  |  |  |  |  |  |  |  |  |  |  |  |  |  |  |  |  |
| Apr-16 | 6 |  |  |  |  |  |  |  |  |  |  |  |  |  |  |  |  |  |  |  |  |  |  |  |  |  |  |  |  |  |  |  |  |  |  |  |  |  |  |  |  |  |  |  |  |  |  |  |  |  |  |
| May-16 | 5.2 |  |  |  |  |  |  |  |  |  |  |  |  |  |  |  |  |  |  |  |  |  |  |  |  |  |  |  |  |  |  |  |  |  |  |  |  |  |  |  |  |  |  |  |  |  |  |  |  |  |  |
| Jun-16 | 4.6 |  |  |  |  |  |  |  |  |  |  |  |  |  |  |  |  |  |  |  |  |  |  |  |  |  |  |  |  |  |  |  |  |  |  |  |  |  |  |  |  |  |  |  |  |  |  |  |  |  |  |
| Jul-16 | 4.5 |  |  |  |  |  |  |  |  |  |  |  |  |  |  |  |  |  |  |  |  |  |  |  |  |  |  |  |  |  |  |  |  |  |  |  |  |  |  |  |  |  |  |  |  |  |  |  |  |  |  |
| Aug-16 | 5.1 |  |  |  |  |  |  |  |  |  |  |  |  |  |  |  |  |  |  |  |  |  |  |  |  |  |  |  |  |  |  |  |  |  |  |  |  |  |  |  |  |  |  |  |  |  |  |  |  |  |  |
| Sep-16 | 5.2 |  |  |  |  |  |  |  |  |  |  |  |  |  |  |  |  |  |  |  |  |  |  |  |  |  |  |  |  |  |  |  |  |  |  |  |  |  |  |  |  |  |  |  |  |  |  |  |  |  |  |
| Oct-16 | 5.7 |  |  |  |  |  |  |  |  |  |  |  |  |  |  |  |  |  |  |  |  |  |  |  |  |  |  |  |  |  |  |  |  |  |  |  |  |  |  |  |  |  |  |  |  |  |  |  |  |  |  |
| Nov-16 | 5.7 |  |  |  |  |  |  |  |  |  |  |  |  |  |  |  |  |  |  |  |  |  |  |  |  |  |  |  |  |  |  |  |  |  |  |  |  |  |  |  |  |  |  |  |  |  |  |  |  |  |  |
| Dec-16 | 7.4 |  |  |  |  |  |  |  |  |  |  |  |  |  |  |  |  |  |  |  |  |  |  |  |  |  |  |  |  |  |  |  |  |  |  |  |  |  |  |  |  |  |  |  |  |  |  |  |  |  |  |
| Jan-17 | 9.4 |  |  |  |  |  |  |  |  |  |  |  |  |  |  |  |  |  |  |  |  |  |  |  |  |  |  |  |  |  |  |  |  |  |  |  |  |  |  |  |  |  |  |  |  |  |  |  |  |  |  |
| Feb-17 | 8.8 |  |  |  |  |  |  |  |  |  |  |  |  |  |  |  |  |  |  |  |  |  |  |  |  |  |  |  |  |  |  |  |  |  |  |  |  |  |  |  |  |  |  |  |  |  |  |  |  |  |  |
| Mar-17 | 8.4 |  |  |  |  |  |  |  |  |  |  |  |  |  |  |  |  |  |  |  |  |  |  |  |  |  |  |  |  |  |  |  |  |  |  |  |  |  |  |  |  |  |  |  |  |  |  |  |  |  |  |
| Apr-17 | 6.3 |  |  |  |  |  |  |  |  |  |  |  |  |  |  |  |  |  |  |  |  |  |  |  |  |  |  |  |  |  |  |  |  |  |  |  |  |  |  |  |  |  |  |  |  |  |  |  |  |  |  |
| May-17 | 5.3 |  |  |  |  |  |  |  |  |  |  |  |  |  |  |  |  |  |  |  |  |  |  |  |  |  |  |  |  |  |  |  |  |  |  |  |  |  |  |  |  |  |  |  |  |  |  |  |  |  |  |
| Jun-17 | 4.5 |  |  |  |  |  |  |  |  |  |  |  |  |  |  |  |  |  |  |  |  |  |  |  |  |  |  |  |  |  |  |  |  |  |  |  |  |  |  |  |  |  |  |  |  |  |  |  |  |  |  |
| Jul-17 | 4.9 |  |  |  |  |  |  |  |  |  |  |  |  |  |  |  |  |  |  |  |  |  |  |  |  |  |  |  |  |  |  |  |  |  |  |  |  |  |  |  |  |  |  |  |  |  |  |  |  |  |  |
| Aug-17 | 4.7 |  |  |  |  |  |  |  |  |  |  |  |  |  |  |  |  |  |  |  |  |  |  |  |  |  |  |  |  |  |  |  |  |  |  |  |  |  |  |  |  |  |  |  |  |  |  |  |  |  |  |
| Sep-17 | 4.7 |  |  |  |  |  |  |  |  |  |  |  |  |  |  |  |  |  |  |  |  |  |  |  |  |  |  |  |  |  |  |  |  |  |  |  |  |  |  |  |  |  |  |  |  |  |  |  |  |  |  |
| Oct-17 | 4.5 |  |  |  |  |  |  |  |  |  |  |  |  |  |  |  |  |  |  |  |  |  |  |  |  |  |  |  |  |  |  |  |  |  |  |  |  |  |  |  |  |  |  |  |  |  |  |  |  |  |  |
| Nov-17 | 5 |  |  |  |  |  |  |  |  |  |  |  |  |  |  |  |  |  |  |  |  |  |  |  |  |  |  |  |  |  |  |  |  |  |  |  |  |  |  |  |  |  |  |  |  |  |  |  |  |  |  |
| Dec-17 | 5.9 |  |  |  |  |  |  |  |  |  |  |  |  |  |  |  |  |  |  |  |  |  |  |  |  |  |  |  |  |  |  |  |  |  |  |  |  |  |  |  |  |  |  |  |  |  |  |  |  |  |  |
| Jan-18 | 7.3 |  |  |  |  |  |  |  |  |  |  |  |  |  |  |  |  |  |  |  |  |  |  |  |  |  |  |  |  |  |  |  |  |  |  |  |  |  |  |  |  |  |  |  |  |  |  |  |  |  |  |
| Feb-18 | 7.8 |  |  |  |  |  |  |  |  |  |  |  |  |  |  |  |  |  |  |  |  |  |  |  |  |  |  |  |  |  |  |  |  |  |  |  |  |  |  |  |  |  |  |  |  |  |  |  |  |  |  |
| Mar-18 | 7.4 |  |  |  |  |  |  |  |  |  |  |  |  |  |  |  |  |  |  |  |  |  |  |  |  |  |  |  |  |  |  |  |  |  |  |  |  |  |  |  |  |  |  |  |  |  |  |  |  |  |  |
| Apr-18 | 6.5 |  |  |  |  |  |  |  |  |  |  |  |  |  |  |  |  |  |  |  |  |  |  |  |  |  |  |  |  |  |  |  |  |  |  |  |  |  |  |  |  |  |  |  |  |  |  |  |  |  |  |
| May-18 | 4.4 |  |  |  |  |  |  |  |  |  |  |  |  |  |  |  |  |  |  |  |  |  |  |  |  |  |  |  |  |  |  |  |  |  |  |  |  |  |  |  |  |  |  |  |  |  |  |  |  |  |  |
| Jun-18 | 4.7 |  |  |  |  |  |  |  |  |  |  |  |  |  |  |  |  |  |  |  |  |  |  |  |  |  |  |  |  |  |  |  |  |  |  |  |  |  |  |  |  |  |  |  |  |  |  |  |  |  |  |
| Jul-18 | 3.4 |  |  |  |  |  |  |  |  |  |  |  |  |  |  |  |  |  |  |  |  |  |  |  |  |  |  |  |  |  |  |  |  |  |  |  |  |  |  |  |  |  |  |  |  |  |  |  |  |  |  |
| Aug-18 | 3.4 |  |  |  |  |  |  |  |  |  |  |  |  |  |  |  |  |  |  |  |  |  |  |  |  |  |  |  |  |  |  |  |  |  |  |  |  |  |  |  |  |  |  |  |  |  |  |  |  |  |  |
| Sep-18 | 4.1 |  |  |  |  |  |  |  |  |  |  |  |  |  |  |  |  |  |  |  |  |  |  |  |  |  |  |  |  |  |  |  |  |  |  |  |  |  |  |  |  |  |  |  |  |  |  |  |  |  |  |
| Oct-18 | 3.6 |  |  |  |  |  |  |  |  |  |  |  |  |  |  |  |  |  |  |  |  |  |  |  |  |  |  |  |  |  |  |  |  |  |  |  |  |  |  |  |  |  |  |  |  |  |  |  |  |  |  |
| Nov-18 | 3.9 |  |  |  |  |  |  |  |  |  |  |  |  |  |  |  |  |  |  |  |  |  |  |  |  |  |  |  |  |  |  |  |  |  |  |  |  |  |  |  |  |  |  |  |  |  |  |  |  |  |  |
| Dec-18 | 5.1 |  |  |  |  |  |  |  |  |  |  |  |  |  |  |  |  |  |  |  |  |  |  |  |  |  |  |  |  |  |  |  |  |  |  |  |  |  |  |  |  |  |  |  |  |  |  |  |  |  |  |
| Jan-19 | 6.4 |  |  |  |  |  |  |  |  |  |  |  |  |  |  |  |  |  |  |  |  |  |  |  |  |  |  |  |  |  |  |  |  |  |  |  |  |  |  |  |  |  |  |  |  |  |  |  |  |  |  |
| Feb-19 | 6.2 |  |  |  |  |  |  |  |  |  |  |  |  |  |  |  |  |  |  |  |  |  |  |  |  |  |  |  |  |  |  |  |  |  |  |  |  |  |  |  |  |  |  |  |  |  |  |  |  |  |  |
| Mar-19 | 5.2 |  |  |  |  |  |  |  |  |  |  |  |  |  |  |  |  |  |  |  |  |  |  |  |  |  |  |  |  |  |  |  |  |  |  |  |  |  |  |  |  |  |  |  |  |  |  |  |  |  |  |
| Apr-19 | 4.7 |  |  |  |  |  |  |  |  |  |  |  |  |  |  |  |  |  |  |  |  |  |  |  |  |  |  |  |  |  |  |  |  |  |  |  |  |  |  |  |  |  |  |  |  |  |  |  |  |  |  |
| May-19 | 3.2 |  |  |  |  |  |  |  |  |  |  |  |  |  |  |  |  |  |  |  |  |  |  |  |  |  |  |  |  |  |  |  |  |  |  |  |  |  |  |  |  |  |  |  |  |  |  |  |  |  |  |
| Jun-19 | 4 |  |  |  |  |  |  |  |  |  |  |  |  |  |  |  |  |  |  |  |  |  |  |  |  |  |  |  |  |  |  |  |  |  |  |  |  |  |  |  |  |  |  |  |  |  |  |  |  |  |  |
| Jul-19 | 3.8 |  |  |  |  |  |  |  |  |  |  |  |  |  |  |  |  |  |  |  |  |  |  |  |  |  |  |  |  |  |  |  |  |  |  |  |  |  |  |  |  |  |  |  |  |  |  |  |  |  |  |
| Aug-19 | 3.6 |  |  |  |  |  |  |  |  |  |  |  |  |  |  |  |  |  |  |  |  |  |  |  |  |  |  |  |  |  |  |  |  |  |  |  |  |  |  |  |  |  |  |  |  |  |  |  |  |  |  |
| Sep-19 | 3.2 |  |  |  |  |  |  |  |  |  |  |  |  |  |  |  |  |  |  |  |  |  |  |  |  |  |  |  |  |  |  |  |  |  |  |  |  |  |  |  |  |  |  |  |  |  |  |  |  |  |  |
| Oct-19 | 4 |  |  |  |  |  |  |  |  |  |  |  |  |  |  |  |  |  |  |  |  |  |  |  |  |  |  |  |  |  |  |  |  |  |  |  |  |  |  |  |  |  |  |  |  |  |  |  |  |  |  |
| Nov-19 | 4.4 |  |  |  |  |  |  |  |  |  |  |  |  |  |  |  |  |  |  |  |  |  |  |  |  |  |  |  |  |  |  |  |  |  |  |  |  |  |  |  |  |  |  |  |  |  |  |  |  |  |  |
| Dec-19 | 5 |  |  |  |  |  |  |  |  |  |  |  |  |  |  |  |  |  |  |  |  |  |  |  |  |  |  |  |  |  |  |  |  |  |  |  |  |  |  |  |  |  |  |  |  |  |  |  |  |  |  |
| Jan-20 | 5.4 |  |  |  |  |  |  |  |  |  |  |  |  |  |  |  |  |  |  |  |  |  |  |  |  |  |  |  |  |  |  |  |  |  |  |  |  |  |  |  |  |  |  |  |  |  |  |  |  |  |  |
| Feb-20 | 5.5 |  |  |  |  |  |  |  |  |  |  |  |  |  |  |  |  |  |  |  |  |  |  |  |  |  |  |  |  |  |  |  |  |  |  |  |  |  |  |  |  |  |  |  |  |  |  |  |  |  |  |
| Mar-20 | 6.9 |  |  |  |  |  |  |  |  |  |  |  |  |  |  |  |  |  |  |  |  |  |  |  |  |  |  |  |  |  |  |  |  |  |  |  |  |  |  |  |  |  |  |  |  |  |  |  |  |  |  |
| Apr-20 | 16.6 |  |  |  |  |  |  |  |  |  |  |  |  |  |  |  |  |  |  |  |  |  |  |  |  |  |  |  |  |  |  |  |  |  |  |  |  |  |  |  |  |  |  |  |  |  |  |  |  |  |  |
| May-20 | 12.7 |  |  |  |  |  |  |  |  |  |  |  |  |  |  |  |  |  |  |  |  |  |  |  |  |  |  |  |  |  |  |  |  |  |  |  |  |  |  |  |  |  |  |  |  |  |  |  |  |  |  |
| Jun-20 | 10.1 |  |  |  |  |  |  |  |  |  |  |  |  |  |  |  |  |  |  |  |  |  |  |  |  |  |  |  |  |  |  |  |  |  |  |  |  |  |  |  |  |  |  |  |  |  |  |  |  |  |  |
| Jul-20 | 8.9 |  |  |  |  |  |  |  |  |  |  |  |  |  |  |  |  |  |  |  |  |  |  |  |  |  |  |  |  |  |  |  |  |  |  |  |  |  |  |  |  |  |  |  |  |  |  |  |  |  |  |
| Aug-20 | 7.6 |  |  |  |  |  |  |  |  |  |  |  |  |  |  |  |  |  |  |  |  |  |  |  |  |  |  |  |  |  |  |  |  |  |  |  |  |  |  |  |  |  |  |  |  |  |  |  |  |  |  |
| Sep-20 | 7.1 |  |  |  |  |  |  |  |  |  |  |  |  |  |  |  |  |  |  |  |  |  |  |  |  |  |  |  |  |  |  |  |  |  |  |  |  |  |  |  |  |  |  |  |  |  |  |  |  |  |  |
| Oct-20 | 6.8 |  |  |  |  |  |  |  |  |  |  |  |  |  |  |  |  |  |  |  |  |  |  |  |  |  |  |  |  |  |  |  |  |  |  |  |  |  |  |  |  |  |  |  |  |  |  |  |  |  |  |
| Nov-20 | 7.3 |  |  |  |  |  |  |  |  |  |  |  |  |  |  |  |  |  |  |  |  |  |  |  |  |  |  |  |  |  |  |  |  |  |  |  |  |  |  |  |  |  |  |  |  |  |  |  |  |  |  |
| Dec-20 | 9.6 |  |  |  |  |  |  |  |  |  |  |  |  |  |  |  |  |  |  |  |  |  |  |  |  |  |  |  |  |  |  |  |  |  |  |  |  |  |  |  |  |  |  |  |  |  |  |  |  |  |  |
| Jan-21 | 9.4 |  |  |  |  |  |  |  |  |  |  |  |  |  |  |  |  |  |  |  |  |  |  |  |  |  |  |  |  |  |  |  |  |  |  |  |  |  |  |  |  |  |  |  |  |  |  |  |  |  |  |
| Feb-21 | 9.6 |  |  |  |  |  |  |  |  |  |  |  |  |  |  |  |  |  |  |  |  |  |  |  |  |  |  |  |  |  |  |  |  |  |  |  |  |  |  |  |  |  |  |  |  |  |  |  |  |  |  |
| Mar-21 | 8.6 |  |  |  |  |  |  |  |  |  |  |  |  |  |  |  |  |  |  |  |  |  |  |  |  |  |  |  |  |  |  |  |  |  |  |  |  |  |  |  |  |  |  |  |  |  |  |  |  |  |  |
| Apr-21 | 7.7 |  |  |  |  |  |  |  |  |  |  |  |  |  |  |  |  |  |  |  |  |  |  |  |  |  |  |  |  |  |  |  |  |  |  |  |  |  |  |  |  |  |  |  |  |  |  |  |  |  |  |
| May-21 | 6.7 |  |  |  |  |  |  |  |  |  |  |  |  |  |  |  |  |  |  |  |  |  |  |  |  |  |  |  |  |  |  |  |  |  |  |  |  |  |  |  |  |  |  |  |  |  |  |  |  |  |  |
| Jun-21 | 7.5 |  |  |  |  |  |  |  |  |  |  |  |  |  |  |  |  |  |  |  |  |  |  |  |  |  |  |  |  |  |  |  |  |  |  |  |  |  |  |  |  |  |  |  |  |  |  |  |  |  |  |